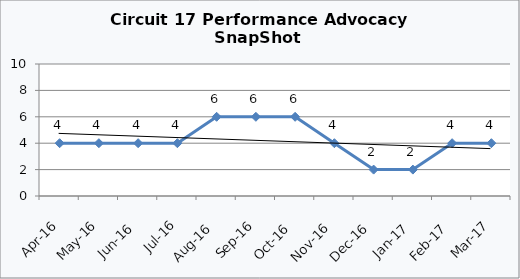
| Category | Circuit 17 |
|---|---|
| Apr-16 | 4 |
| May-16 | 4 |
| Jun-16 | 4 |
| Jul-16 | 4 |
| Aug-16 | 6 |
| Sep-16 | 6 |
| Oct-16 | 6 |
| Nov-16 | 4 |
| Dec-16 | 2 |
| Jan-17 | 2 |
| Feb-17 | 4 |
| Mar-17 | 4 |